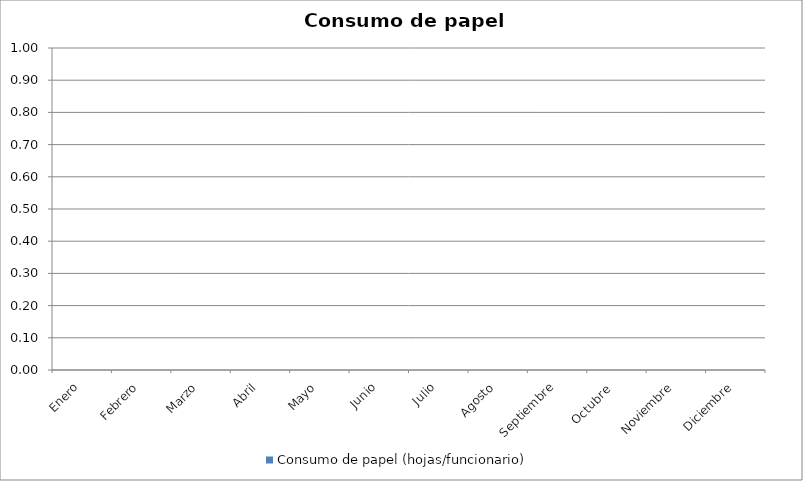
| Category | Consumo de papel (hojas/funcionario) |
|---|---|
| Enero | 0 |
| Febrero | 0 |
| Marzo | 0 |
| Abril | 0 |
| Mayo | 0 |
| Junio | 0 |
| Julio | 0 |
| Agosto | 0 |
| Septiembre | 0 |
| Octubre  | 0 |
| Noviembre | 0 |
| Diciembre | 0 |